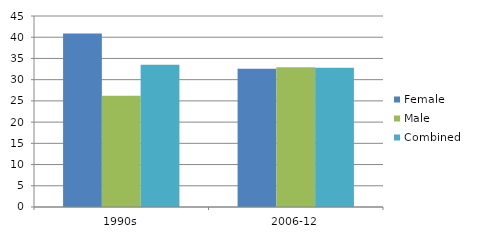
| Category | Female | Male | Combined |
|---|---|---|---|
| 1990s | 40.9 | 26.2 | 33.5 |
| 2006-12 | 32.6 | 32.9 | 32.8 |